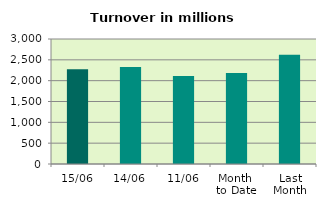
| Category | Series 0 |
|---|---|
| 15/06 | 2276.827 |
| 14/06 | 2328.394 |
| 11/06 | 2109.167 |
| Month 
to Date | 2185.891 |
| Last
Month | 2619.784 |